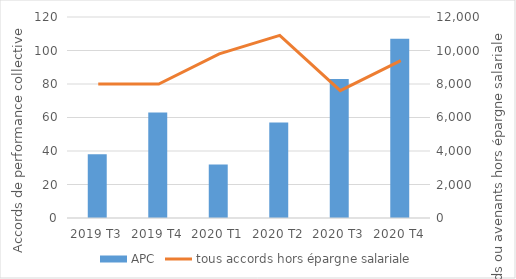
| Category | APC |
|---|---|
| 2019 T3 | 38 |
| 2019 T4 | 63 |
| 2020 T1 | 32 |
| 2020 T2 | 57 |
| 2020 T3 | 83 |
| 2020 T4 | 107 |